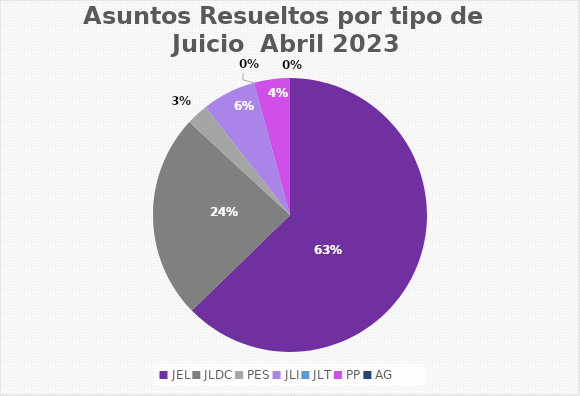
| Category | Asuntos Resueltos por tipo de Juicio  ABRIL |
|---|---|
| JEL | 148 |
| JLDC | 57 |
| PES | 6 |
| JLI | 15 |
| JLT | 0 |
| PP | 10 |
| AG | 0 |